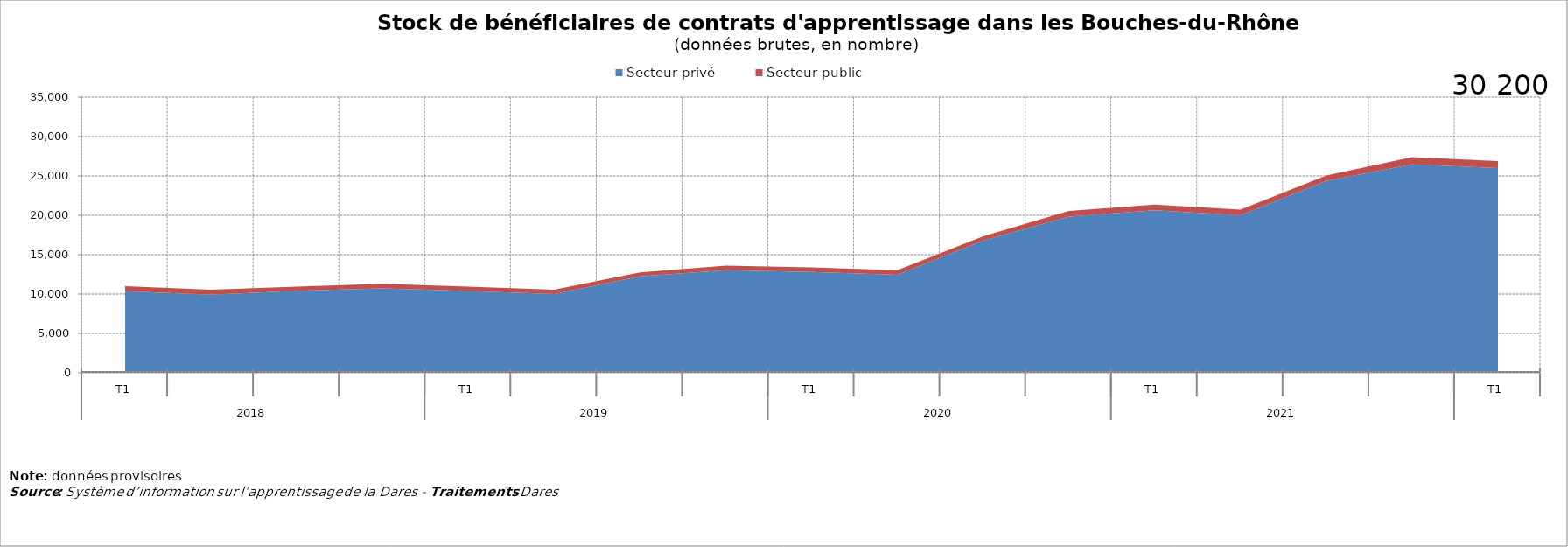
| Category | Secteur privé | Secteur public |
|---|---|---|
| 0 | 10354 | 648 |
| 1 | 9927 | 639 |
| 2 | 10420 | 520 |
| 3 | 10729 | 573 |
| 4 | 10392 | 560 |
| 5 | 10010 | 548 |
| 6 | 12248 | 513 |
| 7 | 13023 | 590 |
| 8 | 12803 | 592 |
| 9 | 12432 | 588 |
| 10 | 16782 | 539 |
| 11 | 19823 | 733 |
| 12 | 20632 | 738 |
| 13 | 19995 | 734 |
| 14 | 24357 | 711 |
| 15 | 26480 | 904 |
| 16 | 25991 | 895 |